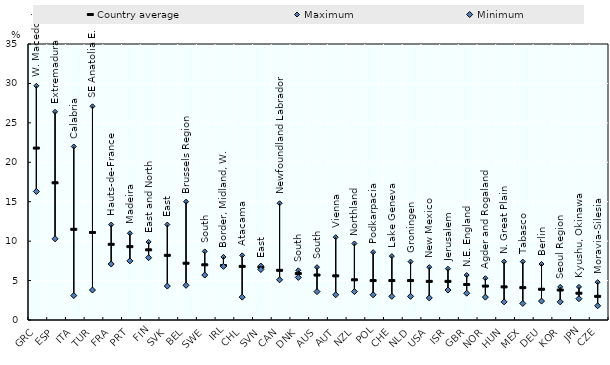
| Category | Country average | Maximum | Minimum |
|---|---|---|---|
| CZE | 3 | 4.8 | 1.8 |
| JPN | 3.4 | 4.2 | 2.7 |
| KOR | 3.8 | 4.2 | 2.3 |
| DEU | 3.9 | 7.1 | 2.4 |
| MEX | 4.1 | 7.4 | 2.1 |
| HUN | 4.2 | 7.4 | 2.3 |
| NOR | 4.3 | 5.3 | 2.9 |
| GBR | 4.5 | 5.7 | 3.4 |
| ISR | 4.9 | 6.5 | 3.8 |
| USA | 4.9 | 6.7 | 2.8 |
| NLD | 5 | 7.4 | 3 |
| CHE | 5 | 8.1 | 3 |
| POL | 5 | 8.6 | 3.2 |
| NZL | 5.1 | 9.7 | 3.6 |
| AUT | 5.6 | 10.5 | 3.2 |
| AUS | 5.7 | 6.7 | 3.6 |
| DNK | 5.9 | 6.3 | 5.4 |
| CAN | 6.3 | 14.8 | 5.1 |
| SVN | 6.7 | 6.9 | 6.4 |
| CHL | 6.8 | 8.2 | 2.9 |
| IRL | 6.9 | 8 | 6.8 |
| SWE | 7 | 8.7 | 5.7 |
| BEL | 7.2 | 15 | 4.4 |
| SVK | 8.2 | 12.1 | 4.3 |
| FIN | 8.9 | 9.9 | 7.9 |
| PRT | 9.3 | 11 | 7.5 |
| FRA | 9.6 | 12.1 | 7.1 |
| TUR | 11.1 | 27.1 | 3.8 |
| ITA | 11.5 | 22 | 3.1 |
| ESP | 17.4 | 26.4 | 10.3 |
| GRC | 21.8 | 29.7 | 16.3 |